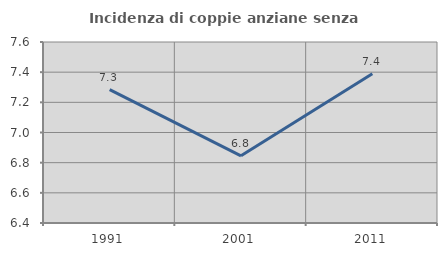
| Category | Incidenza di coppie anziane senza figli  |
|---|---|
| 1991.0 | 7.285 |
| 2001.0 | 6.845 |
| 2011.0 | 7.389 |